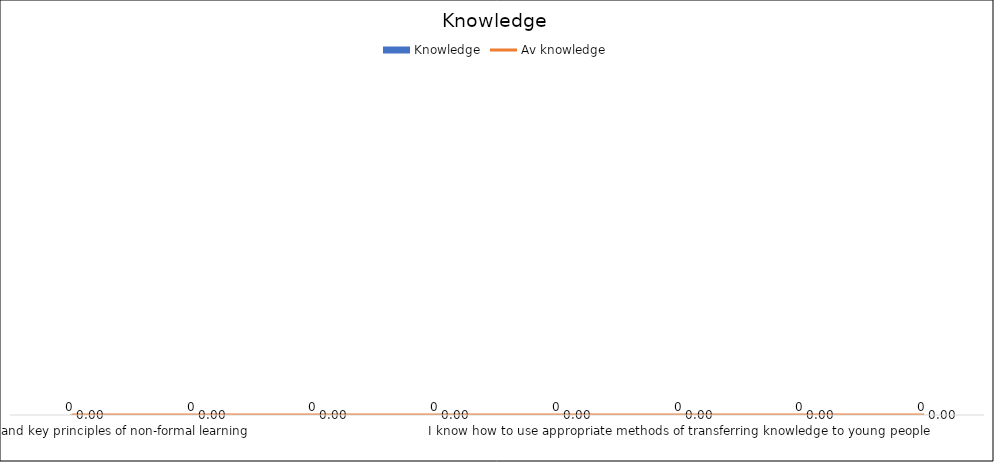
| Category | Knowledge |
|---|---|
| I know the values and key principles of non-formal learning | 0 |
| I have knowledge of the socio-political and economic contexts of young people  | 0 |
| I know about project management processes | 0 |
| I know different educational methods and concepts, and how to tailor and apply these to respective needs | 0 |
| I know about assessment practices in non-formal learning | 0 |
| I know how to use appropriate methods of transferring knowledge to young people | 0 |
| I know about value systems and related mechanisms | 0 |
| I know how to apply research into practice | 0 |